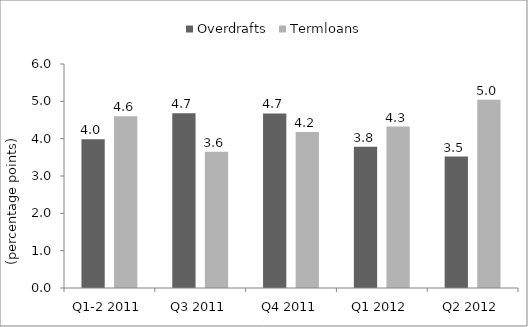
| Category | Overdrafts | Termloans |
|---|---|---|
| Q1-2 2011 | 3.982 | 4.604 |
| Q3 2011 | 4.682 | 3.649 |
| Q4 2011 | 4.677 | 4.178 |
| Q1 2012 | 3.782 | 4.323 |
| Q2 2012 | 3.522 | 5.043 |